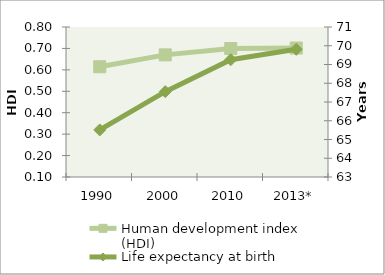
| Category | Human development index (HDI) |
|---|---|
| 1990 | 0.614 |
| 2000 | 0.67 |
| 2010 | 0.699 |
| 2013* | 0.702 |